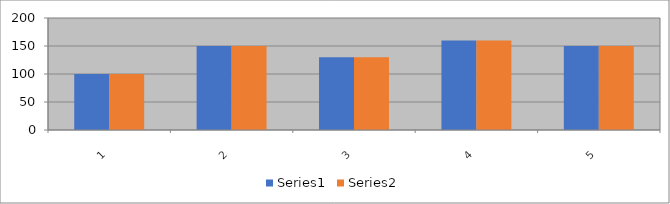
| Category | Series 0 | Series 1 |
|---|---|---|
| 0 |  | 100 |
| 1 |  | 150 |
| 2 |  | 130 |
| 3 |  | 160 |
| 4 |  | 150 |